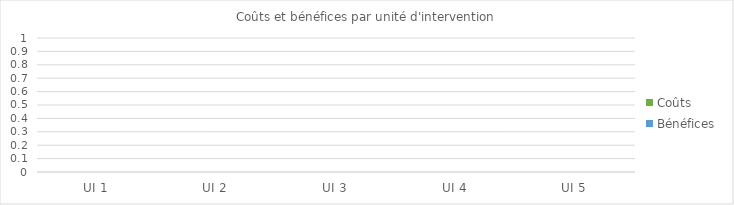
| Category | Series 0 |
|---|---|
| Année 1 | 0 |
| Année 2 | 0 |
| Année 3 | 0 |
| Année 4 | 0 |
| Année 5 | 0 |
| Année 6 | 0 |
| Année 7 | 0 |
| Année 8 | 0 |
| Année 9 | 0 |
| Année 10 | 0 |
| Année 11 | 0 |
| Année 12 | 0 |
| Année 13 | 0 |
| Année 14 | 0 |
| Année 15 | 0 |
| Année 16 | 0 |
| Année 17 | 0 |
| Année 18 | 0 |
| Année 19 | 0 |
| Année 20 | 0 |
| Année 21 | 0 |
| Année 22 | 0 |
| Année 23 | 0 |
| Année 24 | 0 |
| Année 25 | 0 |
| Année 26 | 0 |
| Année 27 | 0 |
| Année 28 | 0 |
| Année 29 | 0 |
| Année 30 | 0 |
| Année 31 | 0 |
| Année 32 | 0 |
| Année 33 | 0 |
| Année 34 | 0 |
| Année 35 | 0 |